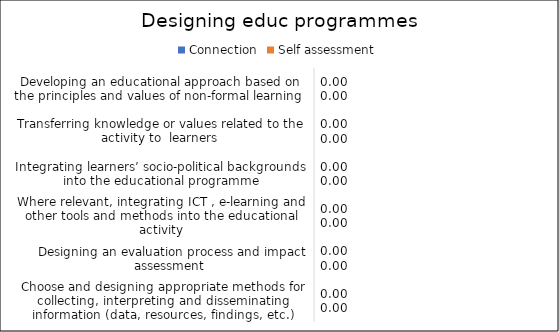
| Category | Connection | Self assessment |
|---|---|---|
| Developing an educational approach based on the principles and values of non-formal learning  | 0 | 0 |
| Transferring knowledge or values related to the activity to  learners  | 0 | 0 |
| Integrating learners’ socio-political backgrounds into the educational programme | 0 | 0 |
| Where relevant, integrating ICT , e-learning and other tools and methods into the educational activity | 0 | 0 |
| Designing an evaluation process and impact assessment  | 0 | 0 |
| Choose and designing appropriate methods for collecting, interpreting and disseminating information (data, resources, findings, etc.) | 0 | 0 |